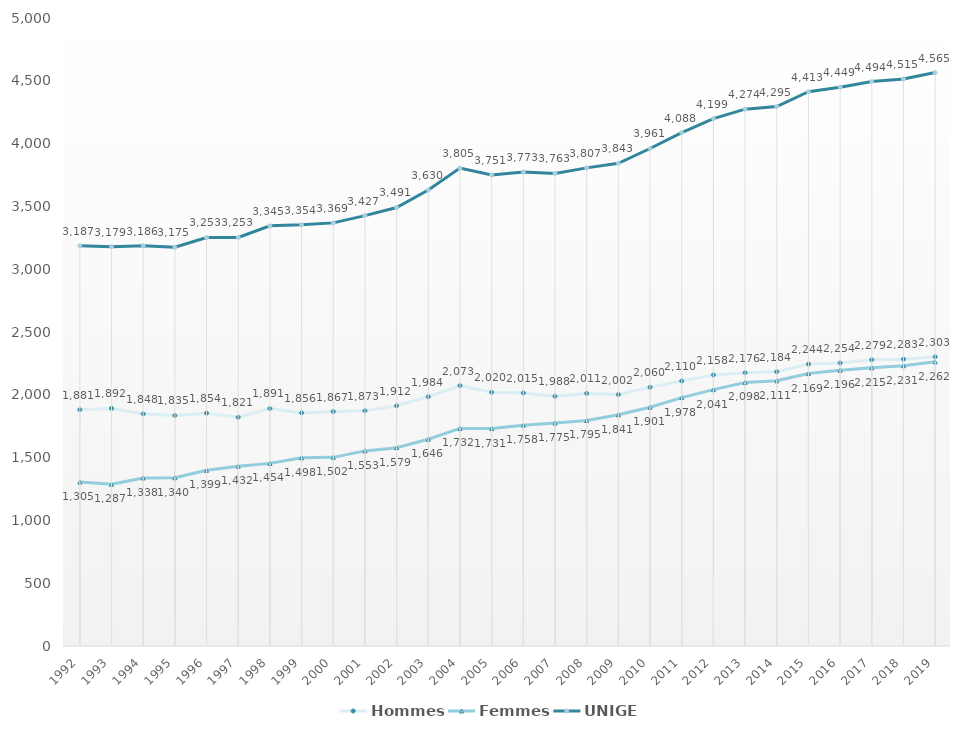
| Category | Hommes | Femmes | UNIGE |
|---|---|---|---|
| 1992 | 1881.177 | 1305.49 | 3186.667 |
| 1993 | 1891.645 | 1287.373 | 3179.018 |
| 1994 | 1848.358 | 1338.068 | 3186.426 |
| 1995 | 1835.208 | 1339.54 | 3174.748 |
| 1996 | 1853.866 | 1398.785 | 3252.651 |
| 1997 | 1821.016 | 1431.925 | 3252.941 |
| 1998 | 1891.08 | 1454.044 | 3345.124 |
| 1999 | 1855.948 | 1498.176 | 3354.124 |
| 2000 | 1866.954 | 1501.834 | 3368.788 |
| 2001 | 1873.491 | 1553.329 | 3426.82 |
| 2002 | 1912.286 | 1579.161 | 3491.447 |
| 2003 | 1984.458 | 1645.987 | 3630.445 |
| 2004 | 2072.901 | 1732.113 | 3805.014 |
| 2005 | 2020.093 | 1730.867 | 3750.96 |
| 2006 | 2014.727 | 1758.481 | 3773.208 |
| 2007 | 1987.784 | 1774.934 | 3762.718 |
| 2008 | 2011.178 | 1795.466 | 3806.644 |
| 2009 | 2001.928 | 1841.474 | 3843.402 |
| 2010 | 2060.102 | 1900.953 | 3961.055 |
| 2011 | 2110.186 | 1977.632 | 4087.818 |
| 2012 | 2157.84 | 2041.044 | 4198.884 |
| 2013 | 2176.121 | 2098.23 | 4274.351 |
| 2014 | 2183.673 | 2111.25 | 4294.923 |
| 2015 | 2244.249 | 2168.753 | 4413.002 |
| 2016 | 2253.538 | 2195.77 | 4449.308 |
| 2017 | 2278.819 | 2215.343 | 4494.162 |
| 2018 | 2283.413 | 2231.485 | 4514.898 |
| 2019 | 2302.961 | 2262.37 | 4565.331 |